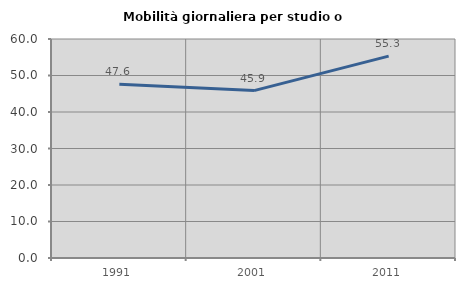
| Category | Mobilità giornaliera per studio o lavoro |
|---|---|
| 1991.0 | 47.588 |
| 2001.0 | 45.866 |
| 2011.0 | 55.32 |